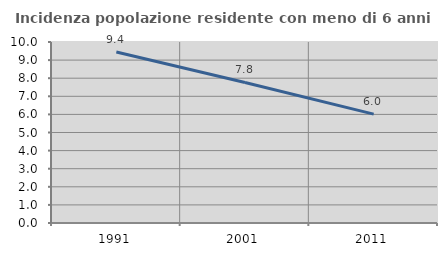
| Category | Incidenza popolazione residente con meno di 6 anni |
|---|---|
| 1991.0 | 9.443 |
| 2001.0 | 7.764 |
| 2011.0 | 6.015 |